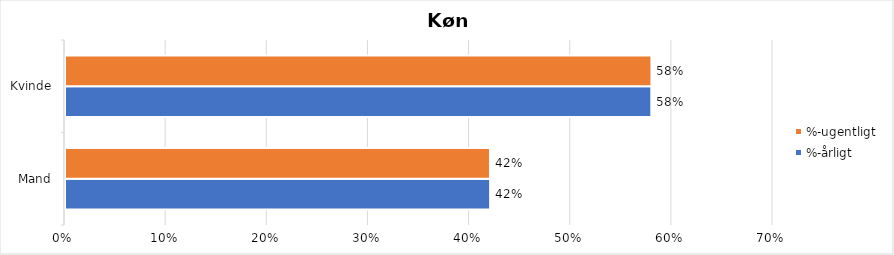
| Category | %-årligt | %-ugentligt |
|---|---|---|
| Mand | 0.42 | 0.42 |
| Kvinde | 0.58 | 0.58 |